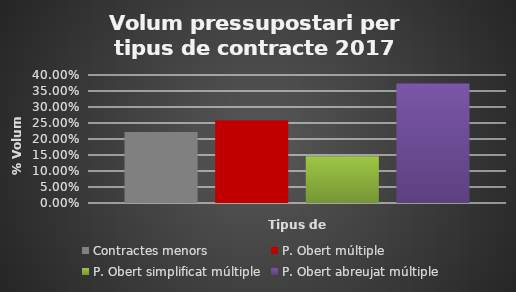
| Category | Contractes menors | P. Obert múltiple | P. Obert simplificat múltiple | P. Obert abreujat múltiple |
|---|---|---|---|---|
| 0 | 0.222 | 0.258 | 0.146 | 0.374 |